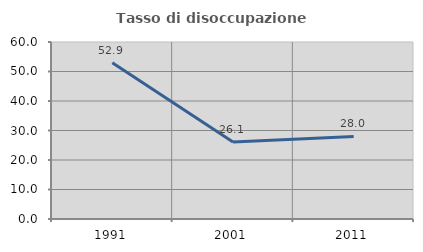
| Category | Tasso di disoccupazione giovanile  |
|---|---|
| 1991.0 | 52.941 |
| 2001.0 | 26.087 |
| 2011.0 | 28 |